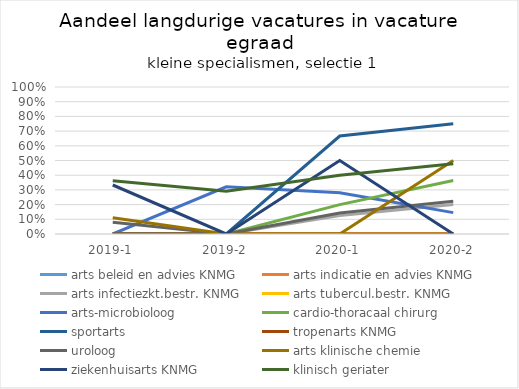
| Category | arts beleid en advies KNMG | arts indicatie en advies KNMG | arts infectiezkt.bestr. KNMG | arts tubercul.bestr. KNMG | arts-microbioloog | cardio-thoracaal chirurg | sportarts | tropenarts KNMG | uroloog | arts klinische chemie | ziekenhuisarts KNMG | klinisch geriater |
|---|---|---|---|---|---|---|---|---|---|---|---|---|
| 2019-1 | 0 | 0 | 0 | 0 | 0 | 0 | 0 | 0 | 0.08 | 0.111 | 0.333 | 0.362 |
| 2019-2 | 0 | 0 | 0 | 0 | 0.321 | 0 | 0 | 0 | 0 | 0 | 0 | 0.292 |
| 2020-1 | 0 | 0 | 0.125 | 0 | 0.281 | 0.2 | 0.667 | 0 | 0.143 | 0 | 0.5 | 0.4 |
| 2020-2 | 0 | 0 | 0.2 | 0 | 0.145 | 0.364 | 0.75 | 0 | 0.222 | 0.5 | 0 | 0.478 |